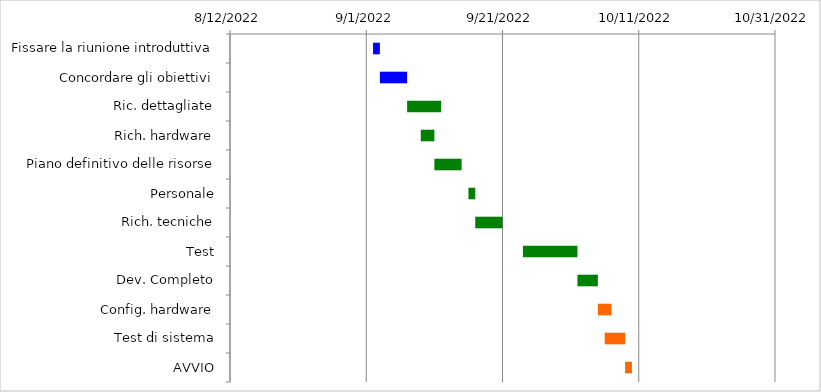
| Category | Inizio | Giorni |
|---|---|---|
| Fissare la riunione introduttiva | 9/2/22 | 1 |
| Concordare gli obiettivi | 9/3/22 | 4 |
| Ric. dettagliate | 9/7/22 | 5 |
| Rich. hardware | 9/9/22 | 2 |
| Piano definitivo delle risorse | 9/11/22 | 4 |
| Personale | 9/16/22 | 1 |
| Rich. tecniche | 9/17/22 | 4 |
| Test | 9/24/22 | 8 |
| Dev. Completo | 10/2/22 | 3 |
| Config. hardware | 10/5/22 | 2 |
| Test di sistema | 10/6/22 | 3 |
| AVVIO | 10/9/22 | 1 |